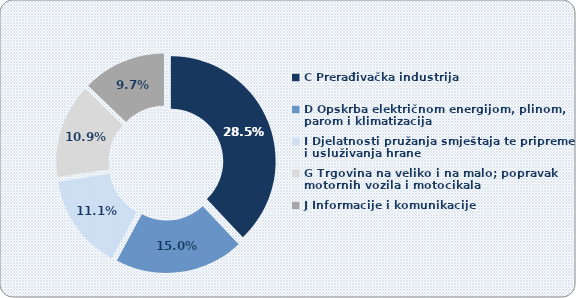
| Category | Udio u dobiti |
|---|---|
| C Prerađivačka industrija | 0.285 |
| D Opskrba električnom energijom, plinom, parom i klimatizacija | 0.15 |
| I Djelatnosti pružanja smještaja te pripreme i usluživanja hrane  | 0.111 |
| G Trgovina na veliko i na malo; popravak motornih vozila i motocikala | 0.109 |
| J Informacije i komunikacije | 0.097 |